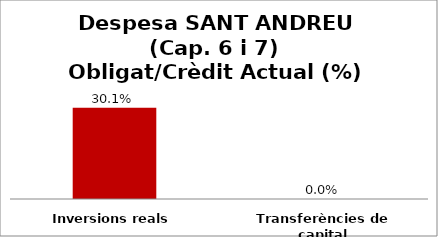
| Category | Series 0 |
|---|---|
| Inversions reals | 0.301 |
| Transferències de capital | 0 |